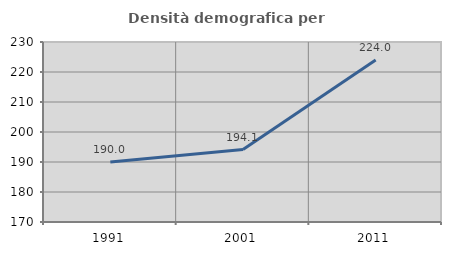
| Category | Densità demografica |
|---|---|
| 1991.0 | 189.966 |
| 2001.0 | 194.14 |
| 2011.0 | 223.982 |